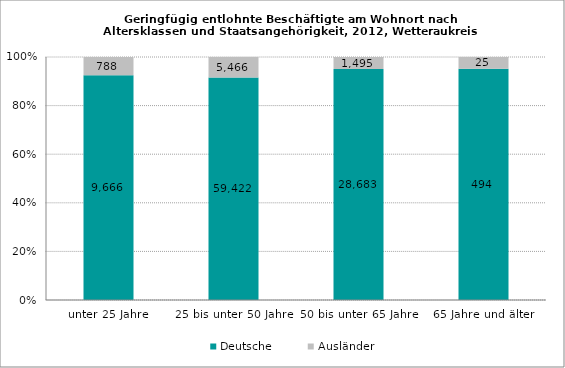
| Category | Deutsche | Ausländer |
|---|---|---|
| unter 25 Jahre | 9666 | 788 |
| 25 bis unter 50 Jahre | 59422 | 5466 |
| 50 bis unter 65 Jahre | 28683 | 1495 |
| 65 Jahre und älter | 494 | 25 |